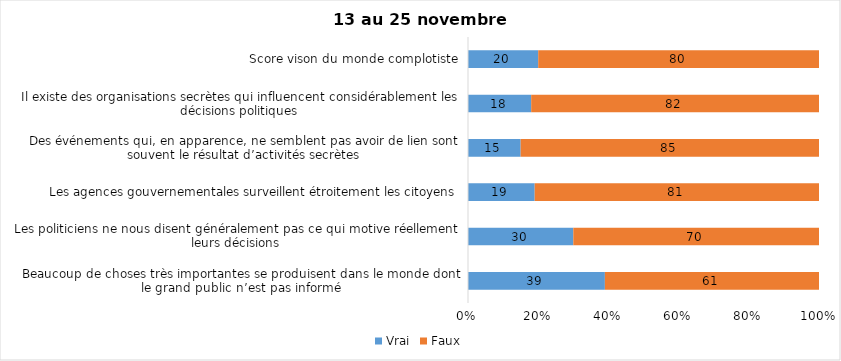
| Category | Vrai | Faux |
|---|---|---|
| Beaucoup de choses très importantes se produisent dans le monde dont le grand public n’est pas informé | 39 | 61 |
| Les politiciens ne nous disent généralement pas ce qui motive réellement leurs décisions | 30 | 70 |
| Les agences gouvernementales surveillent étroitement les citoyens | 19 | 81 |
| Des événements qui, en apparence, ne semblent pas avoir de lien sont souvent le résultat d’activités secrètes | 15 | 85 |
| Il existe des organisations secrètes qui influencent considérablement les décisions politiques | 18 | 82 |
| Score vison du monde complotiste | 20 | 80 |